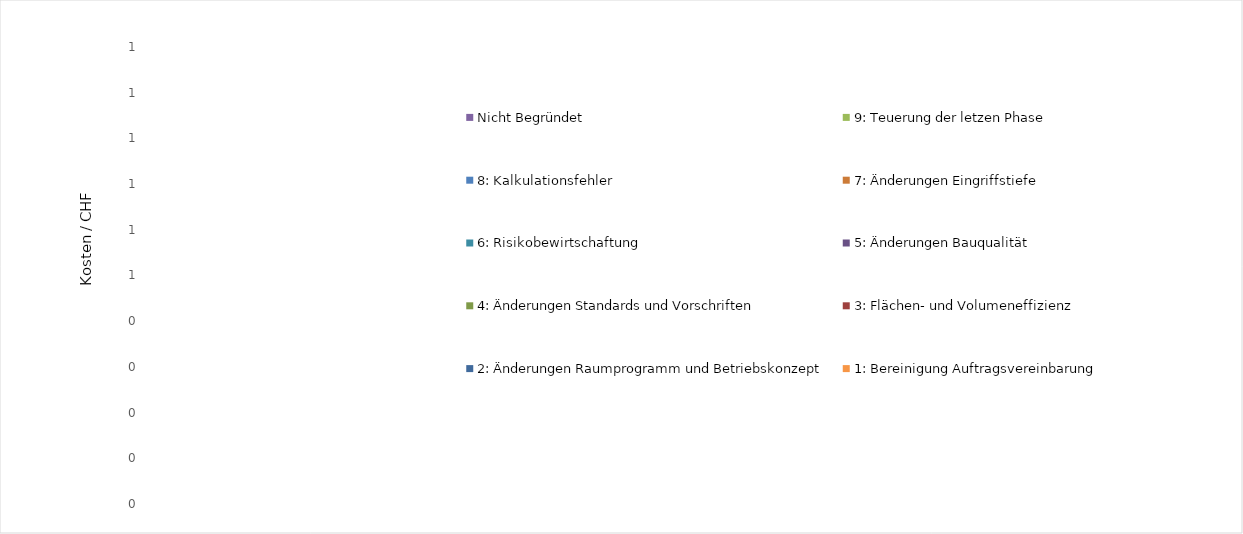
| Category | 1: Bereinigung Auftragsvereinbarung | 2: Änderungen Raumprogramm und Betriebskonzept | 3: Flächen- und Volumeneffizienz | 4: Änderungen Standards und Vorschriften               | 5: Änderungen Bauqualität | 6: Risikobewirtschaftung | 7: Änderungen Eingriffstiefe | 8: Kalkulationsfehler | Nicht gebraucht | 9: Teuerung der letzen Phase | Nicht Begründet |
|---|---|---|---|---|---|---|---|---|---|---|---|
| Franken CHF | 0 | 0 | 0 | 0 | 0 | 0 | 0 | 0 |  | 0 | 0 |